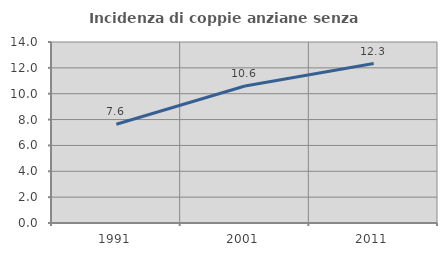
| Category | Incidenza di coppie anziane senza figli  |
|---|---|
| 1991.0 | 7.634 |
| 2001.0 | 10.599 |
| 2011.0 | 12.336 |